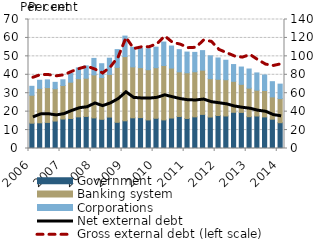
| Category | Government | Banking system | Corporations |
|---|---|---|---|
| 2006.0 | 13.745 | 15.157 | 4.849 |
| 2006.0 | 13.936 | 18.704 | 4.394 |
| 2006.0 | 14.156 | 18.88 | 4.212 |
| 2006.0 | 14.897 | 17.536 | 3.468 |
| 2007.0 | 15.99 | 18.18 | 3.119 |
| 2007.0 | 16.288 | 19.692 | 4.758 |
| 2007.0 | 17.163 | 20.727 | 5.844 |
| 2007.0 | 17.396 | 20.751 | 6.677 |
| 2008.0 | 16.612 | 23.328 | 8.945 |
| 2008.0 | 15.838 | 22.643 | 7.521 |
| 2008.0 | 17.053 | 23.168 | 8.775 |
| 2008.0 | 14.219 | 29.803 | 9.643 |
| 2009.0 | 15.029 | 34.836 | 11.129 |
| 2009.0 | 16.654 | 27.639 | 10.619 |
| 2009.0 | 16.759 | 27.099 | 10.466 |
| 2009.0 | 15.512 | 27.244 | 11.391 |
| 2010.0 | 16.403 | 27.449 | 11.138 |
| 2010.0 | 15.515 | 29.508 | 12.741 |
| 2010.0 | 16.546 | 27.11 | 11.942 |
| 2010.0 | 17.372 | 24.231 | 12.035 |
| 2011.0 | 16.307 | 24.773 | 11.252 |
| 2011.0 | 17.178 | 24.454 | 10.528 |
| 2011.0 | 18.507 | 24.004 | 10.598 |
| 2011.0 | 17.076 | 20.796 | 12.424 |
| 2012.0 | 17.89 | 19.669 | 11.562 |
| 2012.0 | 17.646 | 19.683 | 10.559 |
| 2012.0 | 19.671 | 16.785 | 9.098 |
| 2012.0 | 19.581 | 15.23 | 9.392 |
| 2013.0 | 17.256 | 15.505 | 10.372 |
| 2013.0 | 17.627 | 14.014 | 9.368 |
| 2013.0 | 17.151 | 14.322 | 8.417 |
| 2013.0 | 15.896 | 12.103 | 8.256 |
| 2014.0 | 13.996 | 13.102 | 7.829 |